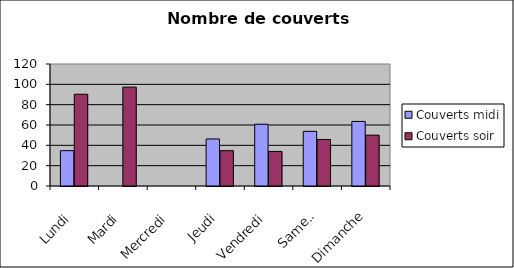
| Category | Couverts |
|---|---|
| Lundi | 90.25 |
| Mardi | 97.25 |
| Mercredi | 0 |
| Jeudi | 34.75 |
| Vendredi | 34 |
| Samedi | 45.75 |
| Dimanche | 50 |